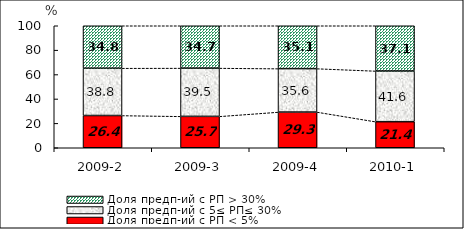
| Category | Доля предп-ий с РП < 5% | Доля предп-ий с 5≤ РП≤ 30% | Доля предп-ий с РП > 30% |
|---|---|---|---|
| 2009-2 | 26.434 | 38.769 | 34.797 |
| 2009-3 | 25.743 | 39.532 | 34.725 |
| 2009-4 | 29.26 | 35.611 | 35.129 |
| 2010-1 | 21.368 | 41.56 | 37.073 |